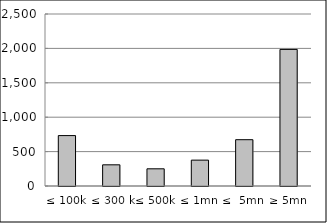
| Category | Series 0 |
|---|---|
| ≤ 100k | 732682305.441 |
| ≤ 300 k | 307931523.385 |
| ≤ 500k | 249826531.8 |
| ≤ 1mn | 376013516.17 |
| ≤  5mn | 673144429.484 |
| ≥ 5mn | 1985277368.7 |